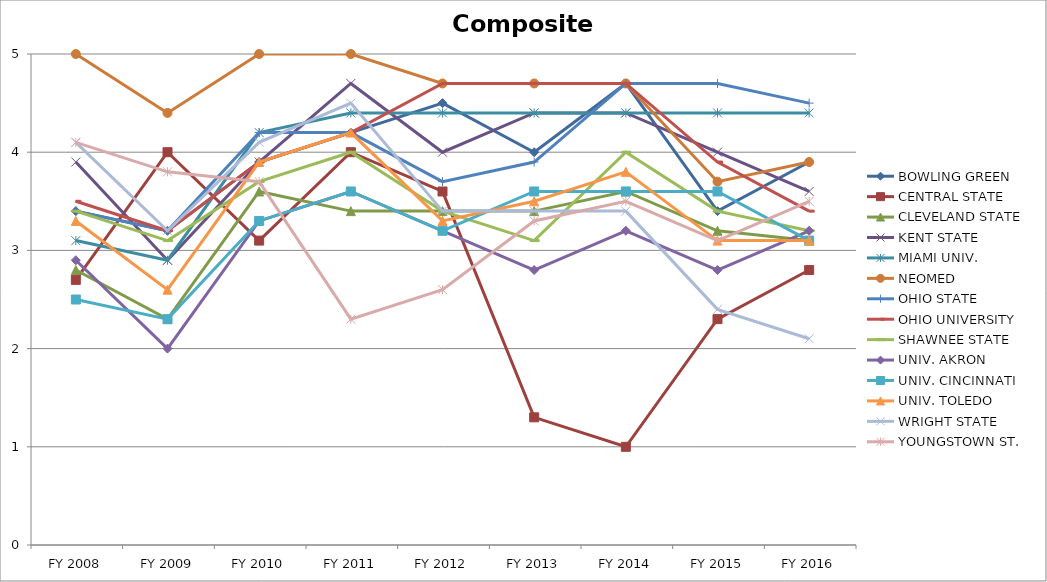
| Category | BOWLING GREEN  | CENTRAL STATE  | CLEVELAND STATE  | KENT STATE  | MIAMI UNIV.  | NEOMED  | OHIO STATE  | OHIO UNIVERSITY  | SHAWNEE STATE  | UNIV. AKRON  | UNIV. CINCINNATI  | UNIV. TOLEDO  | WRIGHT STATE  | YOUNGSTOWN ST.  |
|---|---|---|---|---|---|---|---|---|---|---|---|---|---|---|
| FY 2016 | 3.9 | 2.8 | 3.1 | 3.6 | 4.4 | 3.9 | 4.5 | 3.4 | 3.2 | 3.2 | 3.1 | 3.1 | 2.1 | 3.5 |
| FY 2015 | 3.4 | 2.3 | 3.2 | 4 | 4.4 | 3.7 | 4.7 | 3.9 | 3.4 | 2.8 | 3.6 | 3.1 | 2.4 | 3.1 |
| FY 2014 | 4.7 | 1 | 3.6 | 4.4 | 4.4 | 4.7 | 4.7 | 4.7 | 4 | 3.2 | 3.6 | 3.8 | 3.4 | 3.5 |
| FY 2013 | 4 | 1.3 | 3.4 | 4.4 | 4.4 | 4.7 | 3.9 | 4.7 | 3.1 | 2.8 | 3.6 | 3.5 | 3.4 | 3.3 |
| FY 2012 | 4.5 | 3.6 | 3.4 | 4 | 4.4 | 4.7 | 3.7 | 4.7 | 3.4 | 3.2 | 3.2 | 3.3 | 3.4 | 2.6 |
| FY 2011 | 4.2 | 4 | 3.4 | 4.7 | 4.4 | 5 | 4.2 | 4.2 | 4 | 3.6 | 3.6 | 4.2 | 4.5 | 2.3 |
| FY 2010 | 3.9 | 3.1 | 3.6 | 3.9 | 4.2 | 5 | 4.2 | 3.9 | 3.7 | 3.3 | 3.3 | 3.9 | 4.1 | 3.7 |
| FY 2009 | 3.2 | 4 | 2.3 | 2.9 | 2.9 | 4.4 | 3.2 | 3.2 | 3.1 | 2 | 2.3 | 2.6 | 3.2 | 3.8 |
| FY 2008 | 3.4 | 2.7 | 2.8 | 3.9 | 3.1 | 5 | 3.4 | 3.5 | 3.4 | 2.9 | 2.5 | 3.3 | 4.1 | 4.1 |